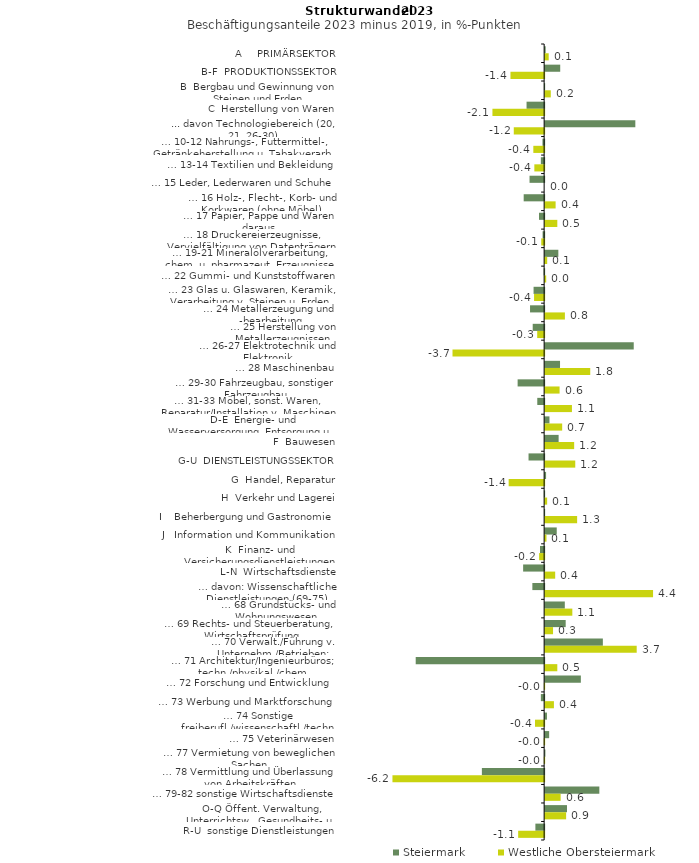
| Category | Steiermark | Westliche Obersteiermark |
|---|---|---|
| A     PRIMÄRSEKTOR | 0.022 | 0.144 |
| B-F  PRODUKTIONSSEKTOR | 0.612 | -1.366 |
| B  Bergbau und Gewinnung von Steinen und Erden | -0.009 | 0.229 |
| C  Herstellung von Waren | -0.714 | -2.098 |
| ... davon Technologiebereich (20, 21, 26-30) | 3.66 | -1.232 |
| … 10-12 Nahrungs-, Futtermittel-, Getränkeherstellung u. Tabakverarb. | -0.068 | -0.439 |
| … 13-14 Textilien und Bekleidung | -0.134 | -0.398 |
| … 15 Leder, Lederwaren und Schuhe | -0.593 | 0 |
| … 16 Holz-, Flecht-, Korb- und Korkwaren (ohne Möbel)  | -0.83 | 0.425 |
| … 17 Papier, Pappe und Waren daraus  | -0.208 | 0.494 |
| … 18 Druckereierzeugnisse, Vervielfältigung von Datenträgern | -0.063 | -0.117 |
| … 19-21 Mineralölverarbeitung, chem. u. pharmazeut. Erzeugnisse | 0.535 | 0.083 |
| … 22 Gummi- und Kunststoffwaren | -0.02 | 0.043 |
| … 23 Glas u. Glaswaren, Keramik, Verarbeitung v. Steinen u. Erden  | -0.429 | -0.409 |
| … 24 Metallerzeugung und -bearbeitung | -0.572 | 0.802 |
| … 25 Herstellung von Metallerzeugnissen  | -0.464 | -0.282 |
| … 26-27 Elektrotechnik und Elektronik | 3.595 | -3.718 |
| … 28 Maschinenbau | 0.604 | 1.83 |
| … 29-30 Fahrzeugbau, sonstiger Fahrzeugbau | -1.076 | 0.586 |
| … 31-33 Möbel, sonst. Waren, Reparatur/Installation v. Maschinen | -0.279 | 1.088 |
| D-E  Energie- und Wasserversorgung, Entsorgung u. Rückgewinnung | 0.175 | 0.692 |
| F  Bauwesen | 0.547 | 1.178 |
| G-U  DIENSTLEISTUNGSSEKTOR | -0.633 | 1.222 |
| G  Handel, Reparatur | 0.038 | -1.44 |
| H  Verkehr und Lagerei | -0.011 | 0.081 |
| I    Beherbergung und Gastronomie | -0.007 | 1.298 |
| J   Information und Kommunikation | 0.471 | 0.054 |
| K  Finanz- und Versicherungsdienstleistungen | -0.168 | -0.204 |
| L-N  Wirtschaftsdienste | -0.853 | 0.408 |
| … davon: Wissenschaftliche Dienstleistungen (69-75) | -0.478 | 4.379 |
| … 68 Grundstücks- und Wohnungswesen  | 0.798 | 1.103 |
| … 69 Rechts- und Steuerberatung, Wirtschaftsprüfung | 0.834 | 0.32 |
| … 70 Verwalt./Führung v. Unternehm./Betrieben; Unternehmensberat. | 2.342 | 3.715 |
| … 71 Architektur/Ingenieurbüros; techn./physikal./chem. Untersuchung | -5.212 | 0.493 |
| … 72 Forschung und Entwicklung  | 1.449 | -0.01 |
| … 73 Werbung und Marktforschung | -0.133 | 0.356 |
| … 74 Sonstige freiberufl./wissenschaftl./techn. Tätigkeiten | 0.074 | -0.37 |
| … 75 Veterinärwesen | 0.163 | -0.017 |
| … 77 Vermietung von beweglichen Sachen  | 0.011 | -0.013 |
| … 78 Vermittlung und Überlassung von Arbeitskräften | -2.527 | -6.155 |
| … 79-82 sonstige Wirtschaftsdienste | 2.199 | 0.629 |
| O-Q Öffent. Verwaltung, Unterrichtsw., Gesundheits- u. Sozialwesen | 0.886 | 0.852 |
| R-U  sonstige Dienstleistungen | -0.355 | -1.055 |